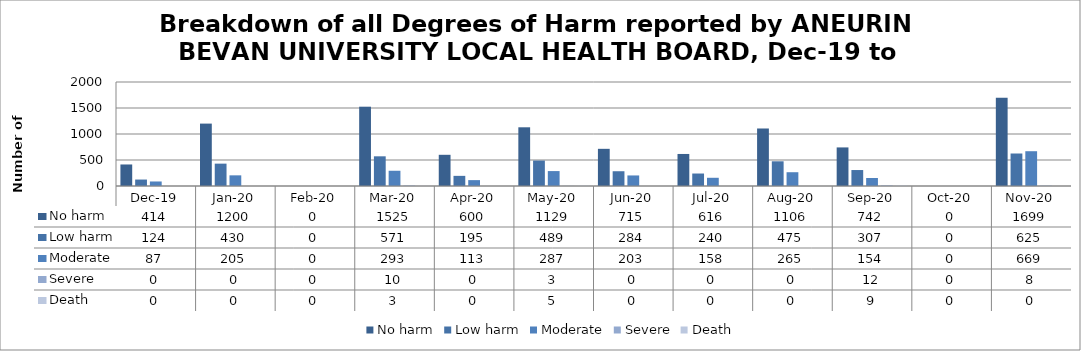
| Category | No harm | Low harm | Moderate | Severe | Death |
|---|---|---|---|---|---|
| Dec-19 | 414 | 124 | 87 | 0 | 0 |
| Jan-20 | 1200 | 430 | 205 | 0 | 0 |
| Feb-20 | 0 | 0 | 0 | 0 | 0 |
| Mar-20 | 1525 | 571 | 293 | 10 | 3 |
| Apr-20 | 600 | 195 | 113 | 0 | 0 |
| May-20 | 1129 | 489 | 287 | 3 | 5 |
| Jun-20 | 715 | 284 | 203 | 0 | 0 |
| Jul-20 | 616 | 240 | 158 | 0 | 0 |
| Aug-20 | 1106 | 475 | 265 | 0 | 0 |
| Sep-20 | 742 | 307 | 154 | 12 | 9 |
| Oct-20 | 0 | 0 | 0 | 0 | 0 |
| Nov-20 | 1699 | 625 | 669 | 8 | 0 |